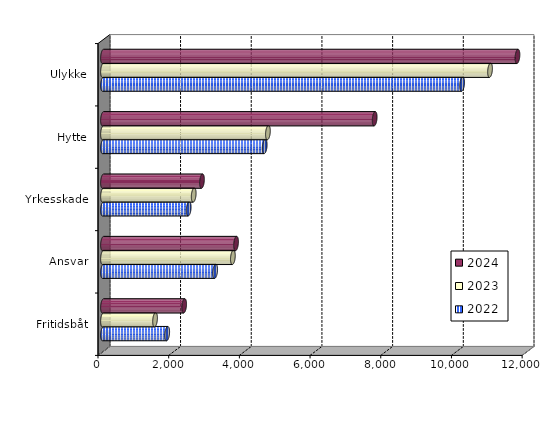
| Category | 2022 | 2023 | 2024 |
|---|---|---|---|
| Fritidsbåt | 1816.335 | 1472.777 | 2296.27 |
| Ansvar | 3173.582 | 3674.731 | 3764.605 |
| Yrkesskade | 2424.515 | 2566.459 | 2800.385 |
| Hytte | 4575 | 4666 | 7686.217 |
| Ulykke | 10160.967 | 10950.025 | 11726.093 |